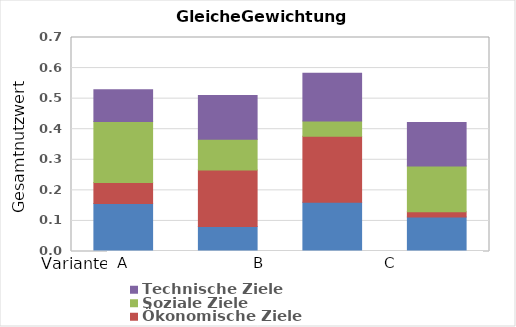
| Category | Umwelt- und Ressourcenschutz | Ökonomische Ziele | Soziale Ziele | Technische Ziele |
|---|---|---|---|---|
| 0 | 0.157 | 0.069 | 0.2 | 0.103 |
| 1 | 0.082 | 0.185 | 0.1 | 0.144 |
| 2 | 0.161 | 0.216 | 0.05 | 0.156 |
| 3 | 0.113 | 0.017 | 0.15 | 0.142 |